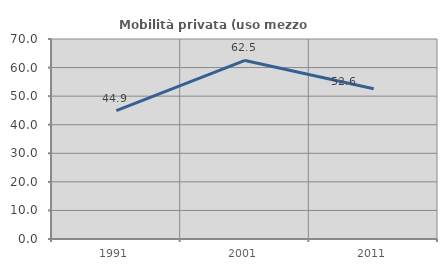
| Category | Mobilità privata (uso mezzo privato) |
|---|---|
| 1991.0 | 44.898 |
| 2001.0 | 62.5 |
| 2011.0 | 52.564 |